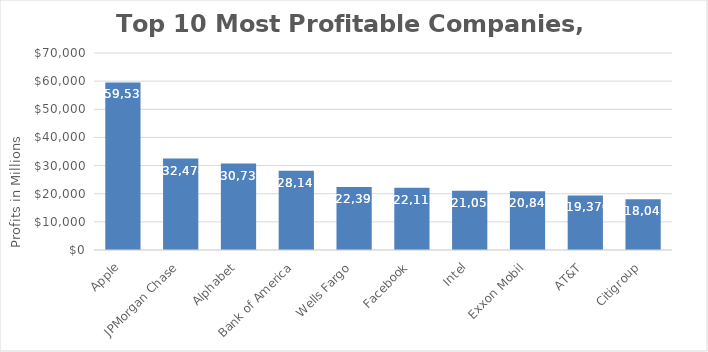
| Category | Series 0 |
|---|---|
| Apple | 59531 |
| JPMorgan Chase | 32474 |
| Alphabet | 30736 |
| Bank of America | 28147 |
| Wells Fargo | 22393 |
| Facebook | 22112 |
| Intel | 21053 |
| Exxon Mobil | 20840 |
| AT&T | 19370 |
| Citigroup | 18045 |